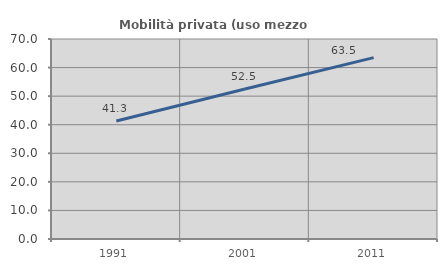
| Category | Mobilità privata (uso mezzo privato) |
|---|---|
| 1991.0 | 41.297 |
| 2001.0 | 52.522 |
| 2011.0 | 63.492 |